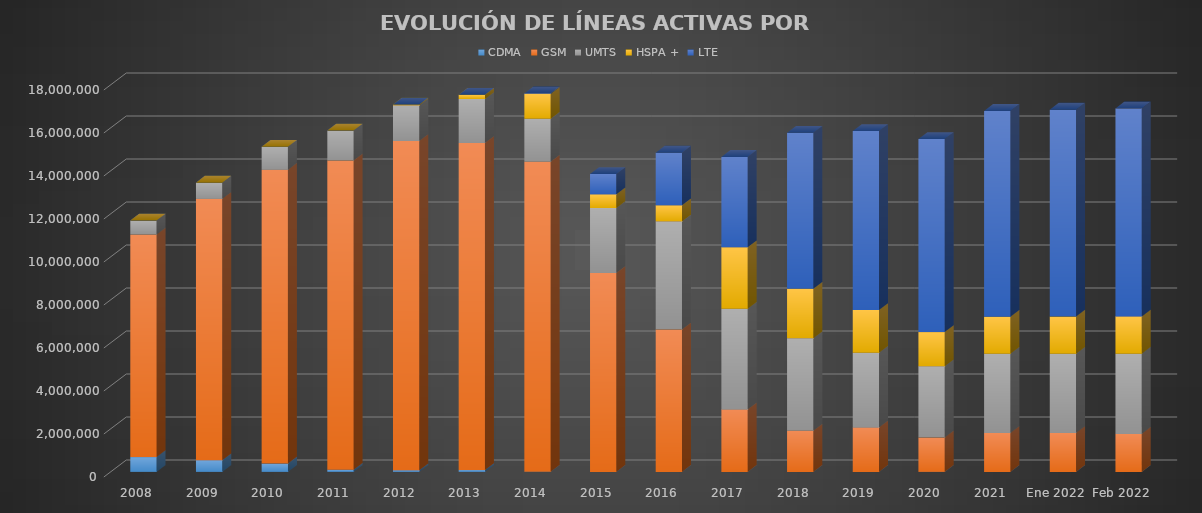
| Category | CDMA | GSM | UMTS | HSPA + | LTE |
|---|---|---|---|---|---|
| 2008 | 688357 | 10346902 | 656989 | 0 | 0 |
| 2009 | 544313 | 12151710 | 758577 | 0 | 0 |
| 2010 | 389834 | 13657394 | 1071603 | 0 | 0 |
| 2011 | 102115 | 14379423 | 1393020 | 0 | 0 |
| 2012 | 75179 | 15310006 | 1658596 | 43082 | 0 |
| 2013 | 83748 | 15215287 | 2043321 | 199398 | 0 |
| 2014 | 3009 | 14418144 | 2006405 | 1148823 | 28176 |
| 2015 | 0 | 9252920 | 3019889 | 636488 | 949723 |
| 2016 | 0 | 6621574 | 5027714 | 748032 | 2450814 |
| 2017 | 0 | 2903370.634 | 4688270.066 | 2852941.199 | 4206822.101 |
| 2018 | 0 | 1909938.891 | 4302462.415 | 2301651 | 7258785.694 |
| 2019 | 0 | 2068130.505 | 3468519.705 | 1995507 | 8320942.79 |
| 2020 | 0 | 1595680.621 | 3315009.099 | 1591073 | 8983603.28 |
| 2021 | 0 | 1804531 | 3688873 | 1717066 | 9579130 |
| Ene 2022 | 0 | 1805568.915 | 3691993.367 | 1724655 | 9625971.718 |
| Feb 2022 | 0 | 1766433.449 | 3732997.987 | 1730603 | 9675803.564 |